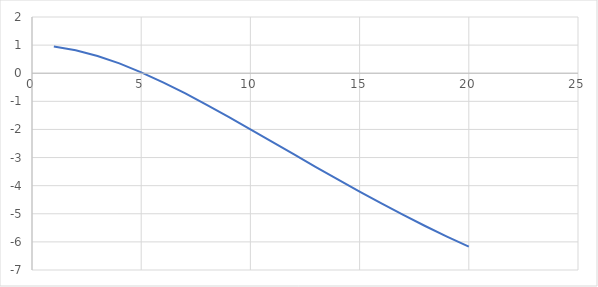
| Category | 1-GS2(1-IR)GSIR |
|---|---|
| 1.0 | 0.952 |
| 2.0 | 0.82 |
| 3.0 | 0.614 |
| 4.0 | 0.348 |
| 5.0 | 0.033 |
| 6.0 | -0.323 |
| 7.0 | -0.711 |
| 8.0 | -1.123 |
| 9.0 | -1.553 |
| 10.0 | -1.994 |
| 11.0 | -2.441 |
| 12.0 | -2.891 |
| 13.0 | -3.338 |
| 14.0 | -3.779 |
| 15.0 | -4.212 |
| 16.0 | -4.634 |
| 17.0 | -5.042 |
| 18.0 | -5.435 |
| 19.0 | -5.811 |
| 20.0 | -6.17 |